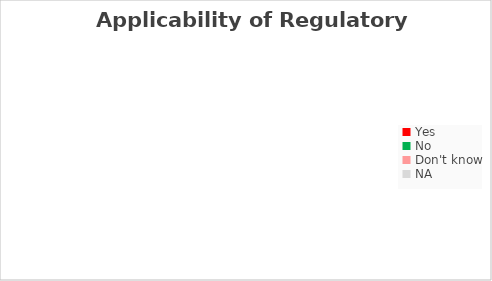
| Category | Applicability of Regulatory Frameworks |
|---|---|
| Yes | 0 |
| No | 0 |
| Don't know | 0 |
| NA | 0 |